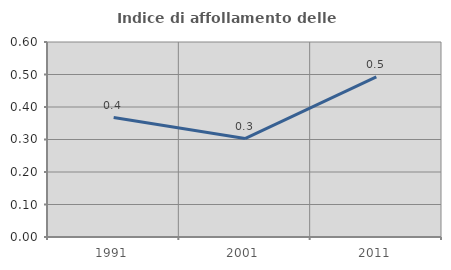
| Category | Indice di affollamento delle abitazioni  |
|---|---|
| 1991.0 | 0.367 |
| 2001.0 | 0.303 |
| 2011.0 | 0.493 |